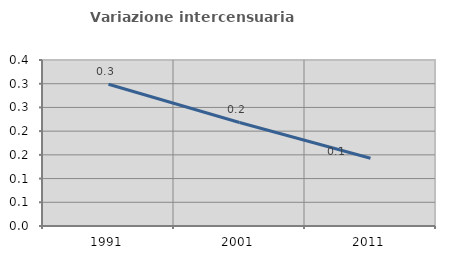
| Category | Variazione intercensuaria annua |
|---|---|
| 1991.0 | 0.299 |
| 2001.0 | 0.218 |
| 2011.0 | 0.143 |